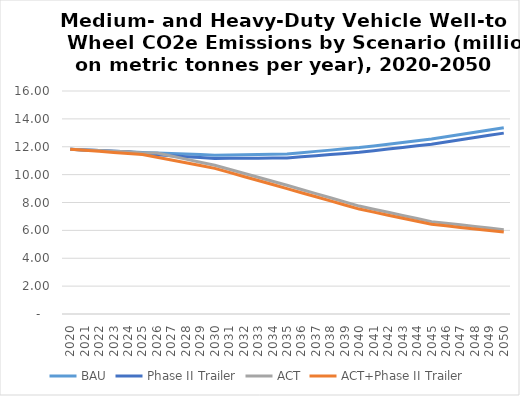
| Category | BAU | Phase II Trailer | ACT | ACT+Phase II Trailer |
|---|---|---|---|---|
| 2020.0 | 11.819 | 11.819 | 11.819 | 11.819 |
| 2021.0 | 11.774 | 11.774 | 11.774 | 11.744 |
| 2022.0 | 11.73 | 11.73 | 11.73 | 11.67 |
| 2023.0 | 11.685 | 11.685 | 11.685 | 11.595 |
| 2024.0 | 11.64 | 11.64 | 11.64 | 11.521 |
| 2025.0 | 11.596 | 11.483 | 11.558 | 11.446 |
| 2026.0 | 11.556 | 11.419 | 11.556 | 11.247 |
| 2027.0 | 11.517 | 11.355 | 11.335 | 11.048 |
| 2028.0 | 11.477 | 11.29 | 11.114 | 10.849 |
| 2029.0 | 11.438 | 11.226 | 10.893 | 10.65 |
| 2030.0 | 11.398 | 11.162 | 10.672 | 10.451 |
| 2031.0 | 11.416 | 11.168 | 10.385 | 10.16 |
| 2032.0 | 11.434 | 11.174 | 10.097 | 9.869 |
| 2033.0 | 11.452 | 11.18 | 9.809 | 9.578 |
| 2034.0 | 11.47 | 11.186 | 9.522 | 9.288 |
| 2035.0 | 11.488 | 11.192 | 9.234 | 8.997 |
| 2036.0 | 11.578 | 11.274 | 8.936 | 8.703 |
| 2037.0 | 11.668 | 11.356 | 8.637 | 8.409 |
| 2038.0 | 11.758 | 11.439 | 8.339 | 8.115 |
| 2039.0 | 11.848 | 11.521 | 8.041 | 7.821 |
| 2040.0 | 11.938 | 11.603 | 7.743 | 7.527 |
| 2041.0 | 12.06 | 11.719 | 7.519 | 7.309 |
| 2042.0 | 12.183 | 11.836 | 7.296 | 7.091 |
| 2043.0 | 12.305 | 11.952 | 7.073 | 6.873 |
| 2044.0 | 12.427 | 12.069 | 6.85 | 6.656 |
| 2045.0 | 12.55 | 12.186 | 6.627 | 6.438 |
| 2046.0 | 12.714 | 12.344 | 6.512 | 6.325 |
| 2047.0 | 12.878 | 12.502 | 6.396 | 6.213 |
| 2048.0 | 13.042 | 12.661 | 6.281 | 6.1 |
| 2049.0 | 13.206 | 12.819 | 6.166 | 5.988 |
| 2050.0 | 13.369 | 12.977 | 6.051 | 5.876 |